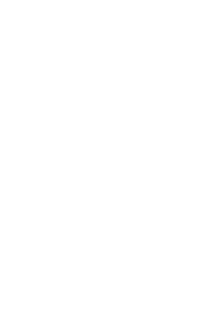
| Category | Series 0 |
|---|---|
| Housing | 0 |
| Transportation | 0 |
| Insurance | 0 |
| Pets | 0 |
| Personal Care | 0 |
| Entertainment / Education | 0 |
| Loans | 0 |
| Gifts and Donations | 0 |
| Food | 0 |
| Legal | 0 |